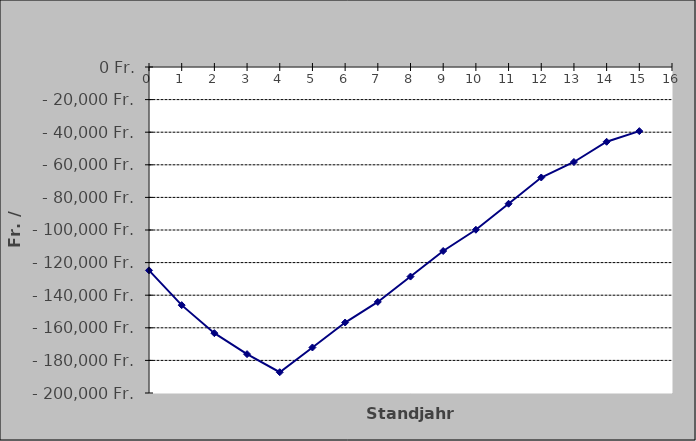
| Category | Series 0 |
|---|---|
| 0.0 | -124765.916 |
| 1.0 | -146096.274 |
| 2.0 | -163288.39 |
| 3.0 | -176166.414 |
| 4.0 | -187242.954 |
| 5.0 | -172072.898 |
| 6.0 | -156766.311 |
| 7.0 | -144131.965 |
| 8.0 | -128573.91 |
| 9.0 | -112875.832 |
| 10.0 | -99846.471 |
| 11.0 | -83889.847 |
| 12.0 | -67789.612 |
| 13.0 | -58277.19 |
| 14.0 | -45869.156 |
| 15.0 | -39349.45 |